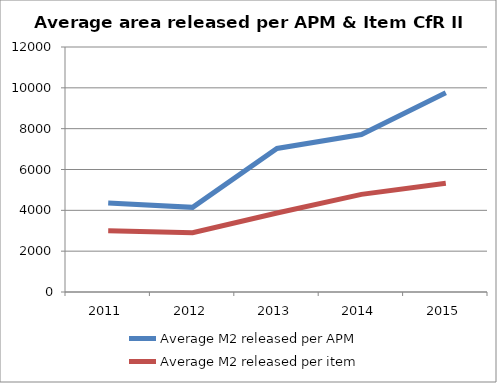
| Category | Average M2 released per APM | Average M2 released per item |
|---|---|---|
| 2011.0 | 4357.88 | 2995.56 |
| 2012.0 | 4145.41 | 2905.69 |
| 2013.0 | 7032.82 | 3871.88 |
| 2014.0 | 7713.4 | 4782.62 |
| 2015.0 | 9760.89 | 5325.47 |